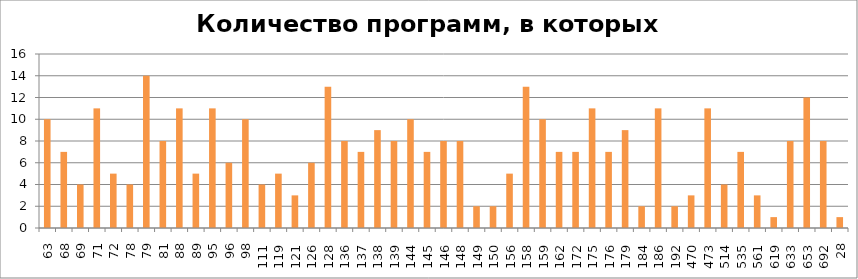
| Category | Количество программ, в которых участвует ОУ |
|---|---|
| 63.0 | 10 |
| 68.0 | 7 |
| 69.0 | 4 |
| 71.0 | 11 |
| 72.0 | 5 |
| 78.0 | 4 |
| 79.0 | 14 |
| 81.0 | 8 |
| 88.0 | 11 |
| 89.0 | 5 |
| 95.0 | 11 |
| 96.0 | 6 |
| 98.0 | 10 |
| 111.0 | 4 |
| 119.0 | 5 |
| 121.0 | 3 |
| 126.0 | 6 |
| 128.0 | 13 |
| 136.0 | 8 |
| 137.0 | 7 |
| 138.0 | 9 |
| 139.0 | 8 |
| 144.0 | 10 |
| 145.0 | 7 |
| 146.0 | 8 |
| 148.0 | 8 |
| 149.0 | 2 |
| 150.0 | 2 |
| 156.0 | 5 |
| 158.0 | 13 |
| 159.0 | 10 |
| 162.0 | 7 |
| 172.0 | 7 |
| 175.0 | 11 |
| 176.0 | 7 |
| 179.0 | 9 |
| 184.0 | 2 |
| 186.0 | 11 |
| 192.0 | 2 |
| 470.0 | 3 |
| 473.0 | 11 |
| 514.0 | 4 |
| 535.0 | 7 |
| 561.0 | 3 |
| 619.0 | 1 |
| 633.0 | 8 |
| 653.0 | 12 |
| 692.0 | 8 |
| 28.0 | 1 |